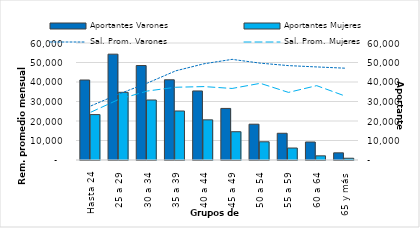
| Category | Aportantes Varones | Aportantes Mujeres |
|---|---|---|
| Hasta 24 | 41023 | 23290 |
| 25 a 29 | 54277 | 34713 |
| 30 a 34 | 48453 | 30777 |
| 35 a 39 | 41143 | 25130 |
| 40 a 44 | 35407 | 20599 |
| 45 a 49 | 26450 | 14505 |
| 50 a 54 | 18360 | 9336 |
| 55 a 59 | 13708 | 6144 |
| 60 a 64 | 9230 | 2135 |
| 65 y más | 3674 | 912 |